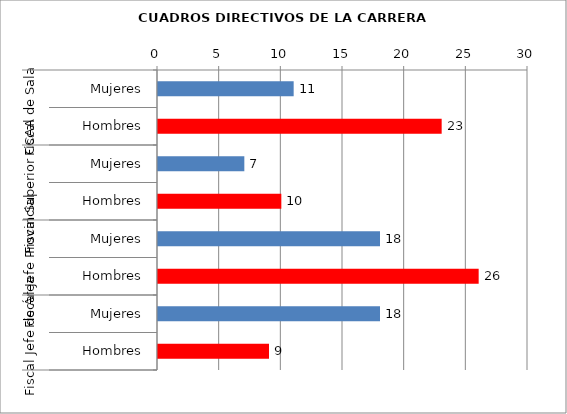
| Category | Series 0 |
|---|---|
| 0 | 11 |
| 1 | 23 |
| 2 | 7 |
| 3 | 10 |
| 4 | 18 |
| 5 | 26 |
| 6 | 18 |
| 7 | 9 |